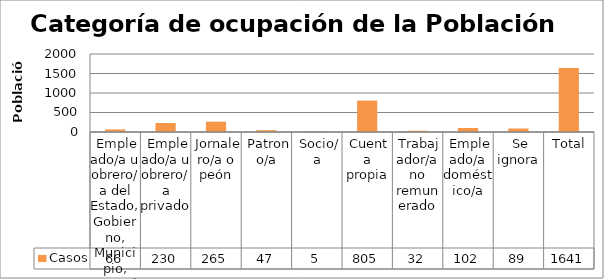
| Category | Casos |
|---|---|
|  Empleado/a u obrero/a del Estado, Gobierno, Municipio, Consejo Provincial, Juntas Parroquiales | 66 |
|  Empleado/a u obrero/a privado | 230 |
|  Jornalero/a o peón | 265 |
|  Patrono/a | 47 |
|  Socio/a | 5 |
|  Cuenta propia | 805 |
|  Trabajador/a no remunerado | 32 |
|  Empleado/a doméstico/a | 102 |
|  Se ignora | 89 |
|  Total | 1641 |